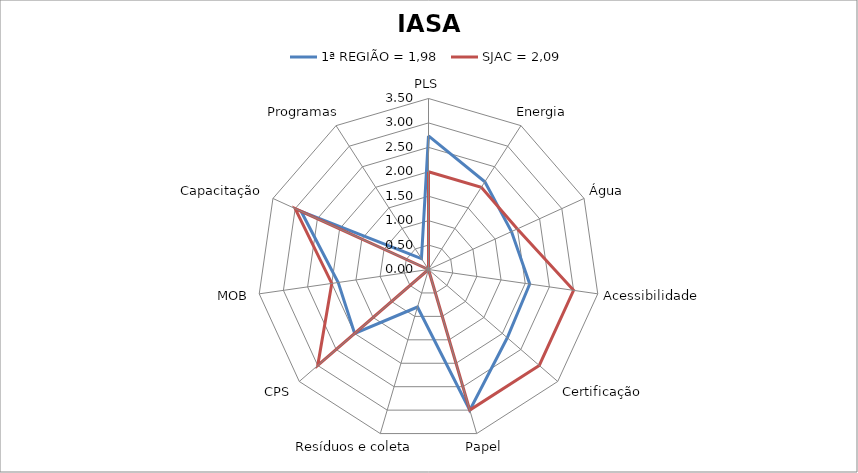
| Category | 1ª REGIÃO = 1,98 | SJAC = 2,09 |
|---|---|---|
| PLS | 2.733 | 2 |
| Energia | 2.133 | 2 |
| Água | 1.867 | 2 |
| Acessibilidade | 2.093 | 3 |
| Certificação | 2.133 | 3 |
| Papel | 3 | 3 |
| Resíduos e coleta | 0.8 | 0 |
| CPS | 2 | 3 |
| MOB | 1.867 | 2 |
| Capacitação | 2.867 | 3 |
| Programas | 0.267 | 0 |